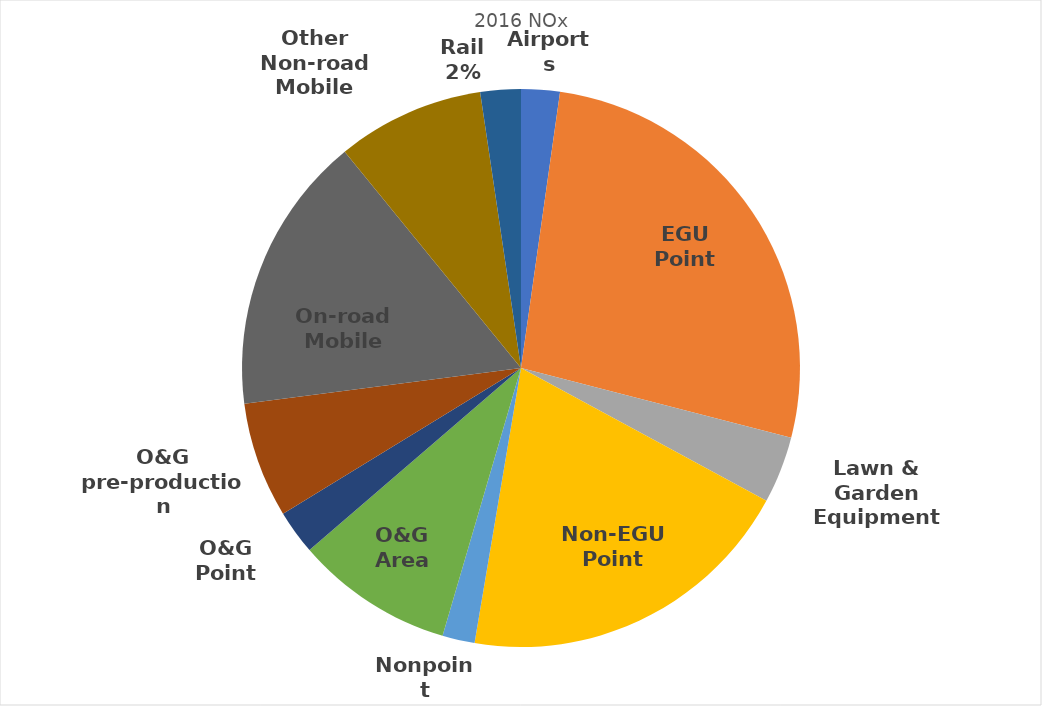
| Category | Total |
|---|---|
| Airports | 0.756 |
| EGU Point | 9.044 |
| Lawn & Garden Equipment | 1.309 |
| Non-EGU Point | 6.677 |
| Nonpoint | 0.633 |
| O&G Area | 3.093 |
| O&G Point | 0.866 |
| O&G pre-production | 2.26 |
| On-road Mobile | 5.458 |
| Other Non-road Mobile | 2.885 |
| Rail | 0.791 |